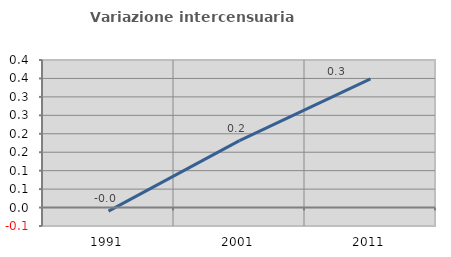
| Category | Variazione intercensuaria annua |
|---|---|
| 1991.0 | -0.01 |
| 2001.0 | 0.182 |
| 2011.0 | 0.349 |